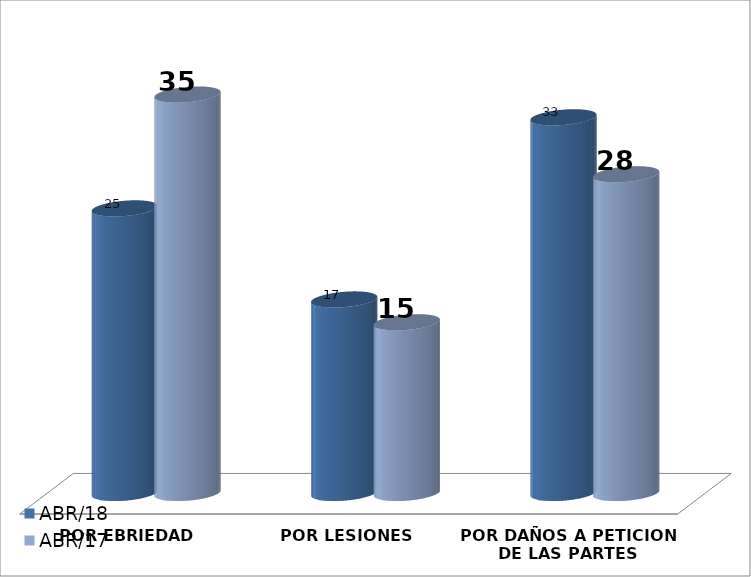
| Category | ABR/18 | ABR/17 |
|---|---|---|
| POR EBRIEDAD | 25 | 35 |
| POR LESIONES | 17 | 15 |
| POR DAÑOS A PETICION DE LAS PARTES | 33 | 28 |